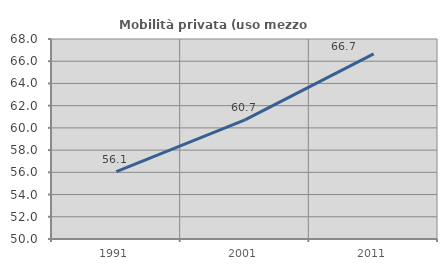
| Category | Mobilità privata (uso mezzo privato) |
|---|---|
| 1991.0 | 56.061 |
| 2001.0 | 60.714 |
| 2011.0 | 66.667 |